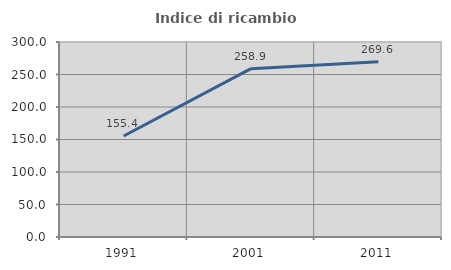
| Category | Indice di ricambio occupazionale  |
|---|---|
| 1991.0 | 155.446 |
| 2001.0 | 258.929 |
| 2011.0 | 269.643 |